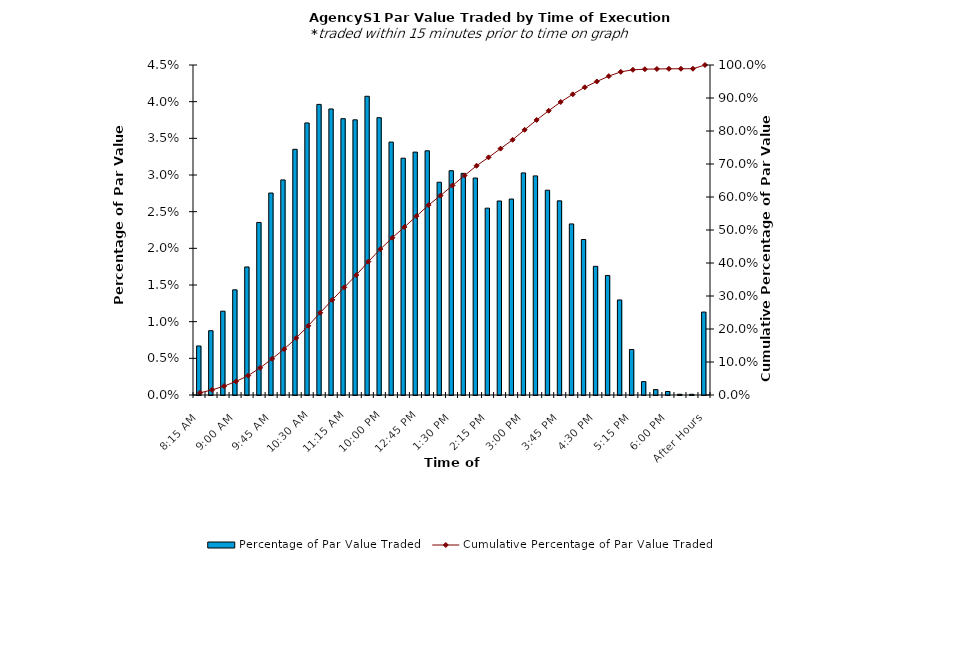
| Category | Percentage of Par Value Traded |
|---|---|
| 8:15 AM | 0.007 |
| 8:30 AM | 0.009 |
| 8:45 AM | 0.011 |
| 9:00 AM | 0.014 |
| 9:15 AM | 0.017 |
| 9:30 AM | 0.024 |
| 9:45 AM | 0.028 |
| 10:00 AM | 0.029 |
| 10:15 AM | 0.034 |
| 10:30 AM | 0.037 |
| 10:45 AM | 0.04 |
| 11:00 AM | 0.039 |
| 11:15 AM | 0.038 |
| 11:30 AM | 0.038 |
| 11:45 AM | 0.041 |
| 12:00 PM | 0.038 |
| 12:15 PM | 0.034 |
| 12:30 PM | 0.032 |
| 12:45 PM | 0.033 |
| 1:00 PM | 0.033 |
| 1:15 PM | 0.029 |
| 1:30 PM | 0.031 |
| 1:45 PM | 0.03 |
| 2:00 PM | 0.03 |
| 2:15 PM | 0.025 |
| 2:30 PM | 0.026 |
| 2:45 PM | 0.027 |
| 3:00 PM | 0.03 |
| 3:15 PM | 0.03 |
| 3:30 PM | 0.028 |
| 3:45 PM | 0.026 |
| 4:00 PM | 0.023 |
| 4:15 PM | 0.021 |
| 4:30 PM | 0.018 |
| 4:45 PM | 0.016 |
| 5:00 PM | 0.013 |
| 5:15 PM | 0.006 |
| 5:30 PM | 0.002 |
| 5:45 PM | 0.001 |
| 6:00 PM | 0 |
| 6:15 PM | 0 |
| 6:30 PM | 0 |
| After Hours | 0.011 |